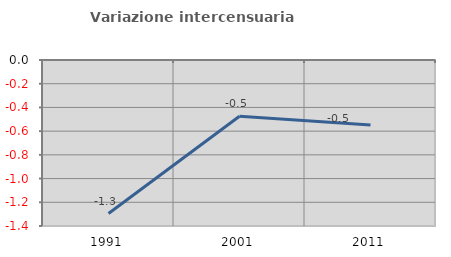
| Category | Variazione intercensuaria annua |
|---|---|
| 1991.0 | -1.295 |
| 2001.0 | -0.474 |
| 2011.0 | -0.549 |